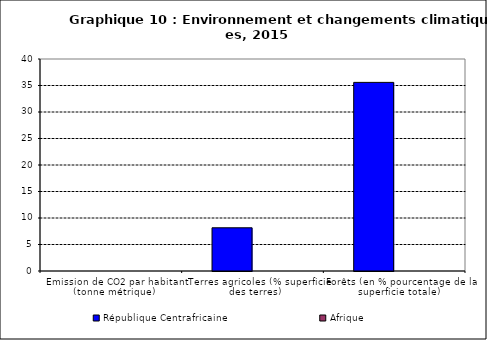
| Category | République Centrafricaine | Afrique |
|---|---|---|
| Emission de CO2 par habitant (tonne métrique) | 0 | 0 |
| Terres agricoles (% superficie des terres) | 8.154 | 0 |
| Forêts (en % pourcentage de la superficie totale) | 35.587 | 0 |